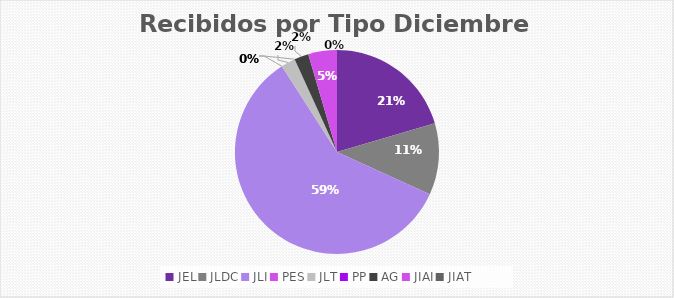
| Category | Series 0 |
|---|---|
| JEL | 9 |
| JLDC | 5 |
| JLI | 26 |
| PES | 0 |
| JLT | 1 |
| PP | 0 |
| AG | 1 |
| JIAI | 2 |
| JIAT | 0 |